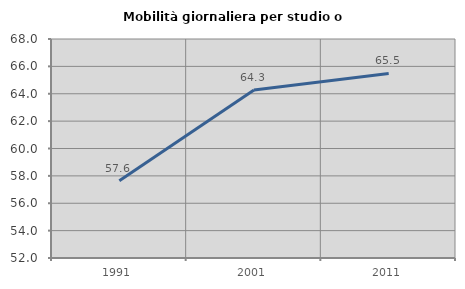
| Category | Mobilità giornaliera per studio o lavoro |
|---|---|
| 1991.0 | 57.65 |
| 2001.0 | 64.275 |
| 2011.0 | 65.485 |